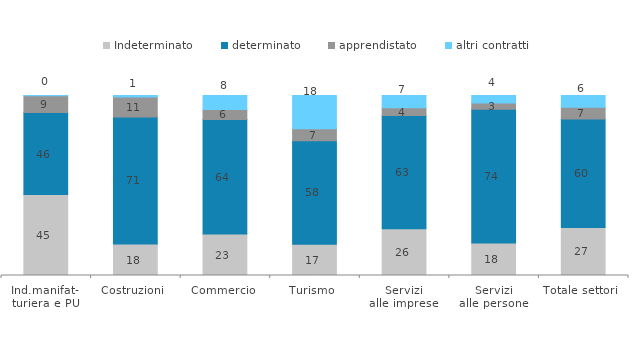
| Category | Indeterminato | determinato | apprendistato | altri contratti |
|---|---|---|---|---|
| Ind.manifat-
turiera e PU | 44.931 | 45.622 | 9.309 | 0.138 |
| Costruzioni | 17.566 | 70.514 | 11.041 | 0.878 |
| Commercio | 23.043 | 63.587 | 5.652 | 7.717 |
| Turismo | 17.383 | 57.541 | 6.663 | 18.413 |
| Servizi
alle imprese | 26.003 | 62.897 | 4.325 | 6.774 |
| Servizi
alle persone | 18.004 | 74.331 | 3.471 | 4.194 |
| Totale settori | 26.719 | 60.204 | 6.595 | 6.482 |